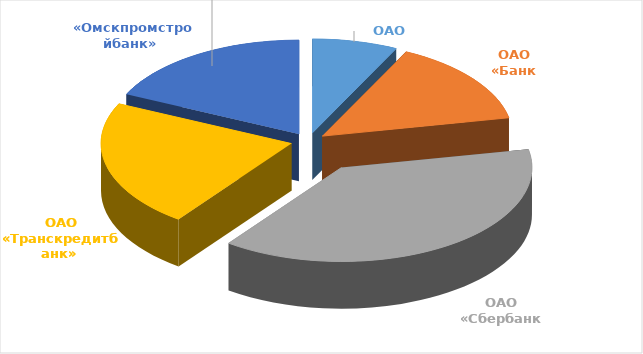
| Category | Series 1 |
|---|---|
| ОАО «ИТ-Банк»  | 143555278 |
| ОАО «Банк Москвы»  | 288956213 |
| ОАО «Сбербанк России»  | 756111309 |
| ОАО «Транскредитбанк»  | 432549100 |
| «Омскпромстройбанк»  | 356789515 |